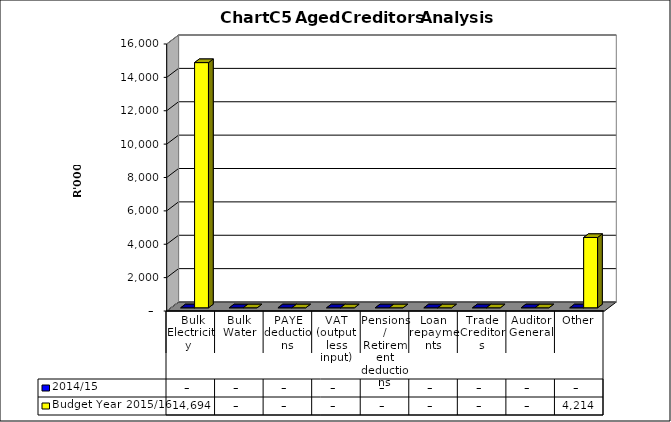
| Category | 2014/15 | Budget Year 2015/16 |
|---|---|---|
|  Bulk Electricity  | 0 | 14693677 |
| Bulk Water | 0 | 0 |
| PAYE deductions | 0 | 0 |
| VAT (output less input) | 0 | 0 |
| Pensions / Retirement deductions | 0 | 0 |
| Loan repayments | 0 | 0 |
| Trade Creditors | 0 | 0 |
| Auditor General | 0 | 0 |
| Other | 0 | 4214239 |